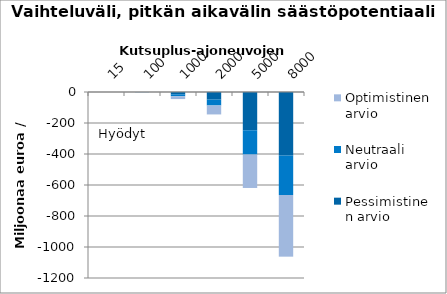
| Category | Pessimistinen arvio | Neutraali arvio | Optimistinen arvio |
|---|---|---|---|
| 15.0 | -0.091 | -0.02 | -0.027 |
| 100.0 | -0.607 | -0.301 | -0.415 |
| 1000.0 | -14.745 | -12.534 | -18.296 |
| 2000.0 | -49.113 | -37.833 | -57.804 |
| 5000.0 | -246.769 | -156.627 | -215.768 |
| 8000.0 | -410.288 | -254.305 | -397.764 |